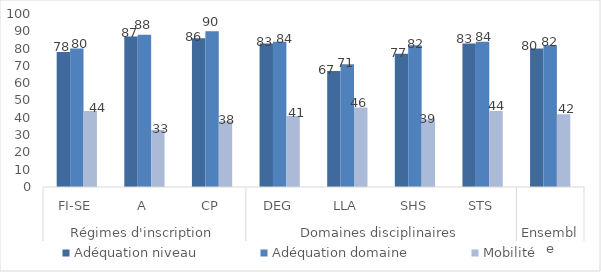
| Category | Adéquation niveau | Adéquation domaine | Mobilité |
|---|---|---|---|
| 0 | 78 | 80 | 44 |
| 1 | 87 | 88 | 33 |
| 2 | 86 | 90 | 38 |
| 3 | 83 | 84 | 41 |
| 4 | 67 | 71 | 46 |
| 5 | 77 | 82 | 39 |
| 6 | 83 | 84 | 44 |
| 7 | 80 | 82 | 42 |